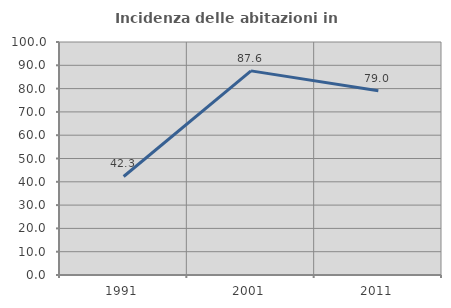
| Category | Incidenza delle abitazioni in proprietà  |
|---|---|
| 1991.0 | 42.276 |
| 2001.0 | 87.611 |
| 2011.0 | 79.048 |